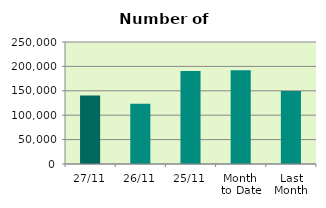
| Category | Series 0 |
|---|---|
| 27/11 | 140186 |
| 26/11 | 123432 |
| 25/11 | 190520 |
| Month 
to Date | 192168.7 |
| Last
Month | 149554.818 |